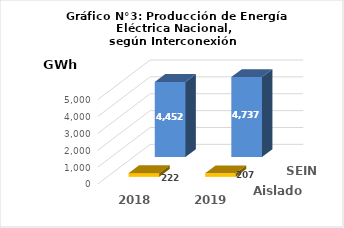
| Category | Aislados | SEIN |
|---|---|---|
| 2018.0 | 221.817 | 4451.907 |
| 2019.0 | 207.207 | 4737.374 |